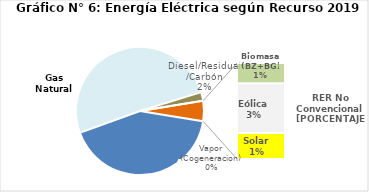
| Category | Series 0 |
|---|---|
| Agua | 1983.124 |
| Gas Natural | 2401.674 |
| Diesel/Residual/Carbón | 103.536 |
| Vapor (Cogeneracion) | 0.353 |
| Biomasa (BZ+BG) | 52.046 |
| Eólica | 125.223 |
| Solar | 66.086 |